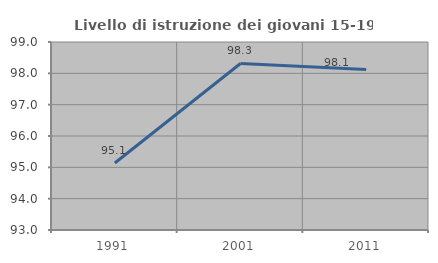
| Category | Livello di istruzione dei giovani 15-19 anni |
|---|---|
| 1991.0 | 95.138 |
| 2001.0 | 98.314 |
| 2011.0 | 98.12 |